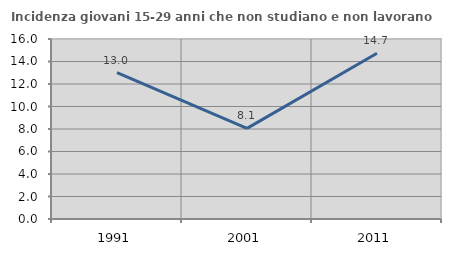
| Category | Incidenza giovani 15-29 anni che non studiano e non lavorano  |
|---|---|
| 1991.0 | 13.01 |
| 2001.0 | 8.06 |
| 2011.0 | 14.737 |